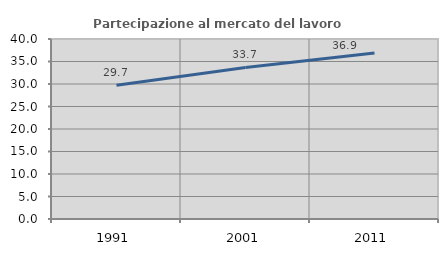
| Category | Partecipazione al mercato del lavoro  femminile |
|---|---|
| 1991.0 | 29.703 |
| 2001.0 | 33.674 |
| 2011.0 | 36.904 |